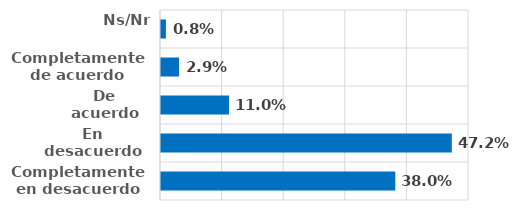
| Category | Series 0 |
|---|---|
| Completamente en desacuerdo | 0.38 |
| En desacuerdo | 0.472 |
| De acuerdo | 0.11 |
| Completamente de acuerdo | 0.029 |
| Ns/Nr | 0.008 |